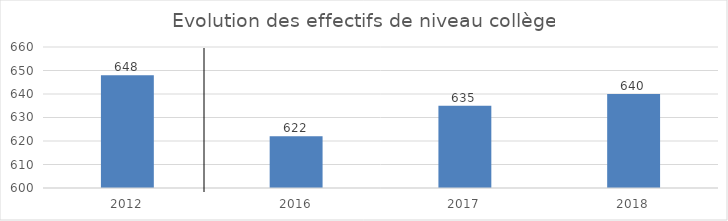
| Category | Series 0 |
|---|---|
| 2012.0 | 648 |
| 2016.0 | 622 |
| 2017.0 | 635 |
| 2018.0 | 640 |